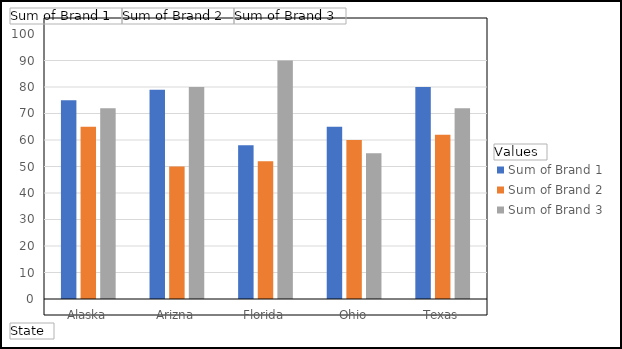
| Category | Sum of Brand 1 | Sum of Brand 2 | Sum of Brand 3 |
|---|---|---|---|
| Alaska | 75 | 65 | 72 |
| Arizna | 79 | 50 | 80 |
| Florida | 58 | 52 | 90 |
| Ohio | 65 | 60 | 55 |
| Texas | 80 | 62 | 72 |